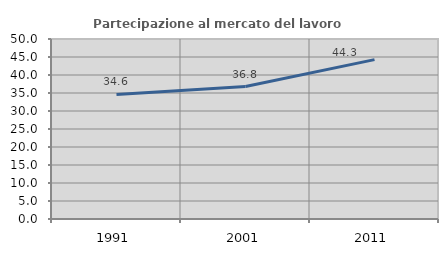
| Category | Partecipazione al mercato del lavoro  femminile |
|---|---|
| 1991.0 | 34.589 |
| 2001.0 | 36.782 |
| 2011.0 | 44.262 |